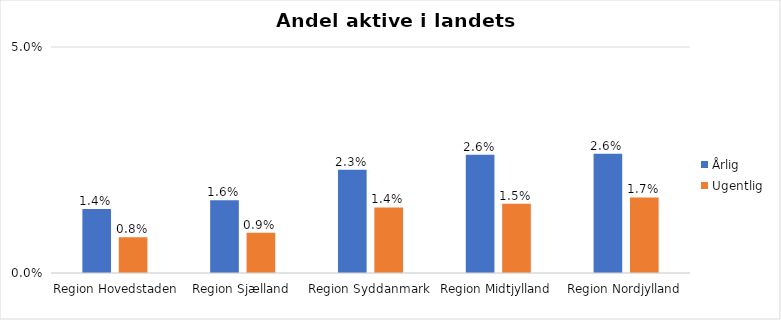
| Category | Årlig | Ugentlig |
|---|---|---|
| Region Hovedstaden | 0.014 | 0.008 |
| Region Sjælland | 0.016 | 0.009 |
| Region Syddanmark | 0.023 | 0.014 |
| Region Midtjylland | 0.026 | 0.015 |
| Region Nordjylland | 0.026 | 0.017 |